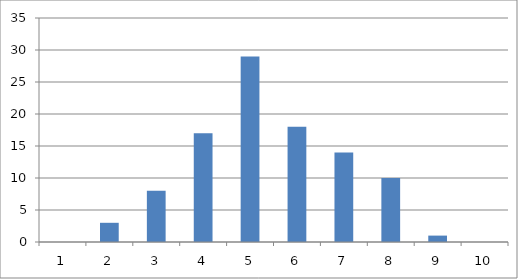
| Category | Series 0 |
|---|---|
| 0 | 0 |
| 1 | 3 |
| 2 | 8 |
| 3 | 17 |
| 4 | 29 |
| 5 | 18 |
| 6 | 14 |
| 7 | 10 |
| 8 | 1 |
| 9 | 0 |